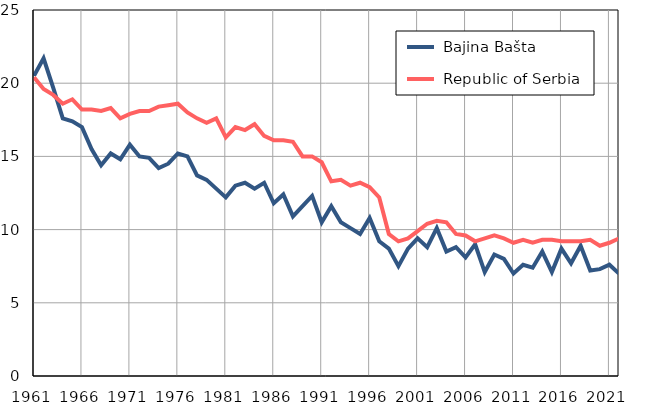
| Category |  Bajina Bašta |  Republic of Serbia |
|---|---|---|
| 1961.0 | 20.5 | 20.4 |
| 1962.0 | 21.7 | 19.6 |
| 1963.0 | 19.7 | 19.2 |
| 1964.0 | 17.6 | 18.6 |
| 1965.0 | 17.4 | 18.9 |
| 1966.0 | 17 | 18.2 |
| 1967.0 | 15.5 | 18.2 |
| 1968.0 | 14.4 | 18.1 |
| 1969.0 | 15.2 | 18.3 |
| 1970.0 | 14.8 | 17.6 |
| 1971.0 | 15.8 | 17.9 |
| 1972.0 | 15 | 18.1 |
| 1973.0 | 14.9 | 18.1 |
| 1974.0 | 14.2 | 18.4 |
| 1975.0 | 14.5 | 18.5 |
| 1976.0 | 15.2 | 18.6 |
| 1977.0 | 15 | 18 |
| 1978.0 | 13.7 | 17.6 |
| 1979.0 | 13.4 | 17.3 |
| 1980.0 | 12.8 | 17.6 |
| 1981.0 | 12.2 | 16.3 |
| 1982.0 | 13 | 17 |
| 1983.0 | 13.2 | 16.8 |
| 1984.0 | 12.8 | 17.2 |
| 1985.0 | 13.2 | 16.4 |
| 1986.0 | 11.8 | 16.1 |
| 1987.0 | 12.4 | 16.1 |
| 1988.0 | 10.9 | 16 |
| 1989.0 | 11.6 | 15 |
| 1990.0 | 12.3 | 15 |
| 1991.0 | 10.5 | 14.6 |
| 1992.0 | 11.6 | 13.3 |
| 1993.0 | 10.5 | 13.4 |
| 1994.0 | 10.1 | 13 |
| 1995.0 | 9.7 | 13.2 |
| 1996.0 | 10.8 | 12.9 |
| 1997.0 | 9.2 | 12.2 |
| 1998.0 | 8.7 | 9.7 |
| 1999.0 | 7.5 | 9.2 |
| 2000.0 | 8.7 | 9.4 |
| 2001.0 | 9.4 | 9.9 |
| 2002.0 | 8.8 | 10.4 |
| 2003.0 | 10.1 | 10.6 |
| 2004.0 | 8.5 | 10.5 |
| 2005.0 | 8.8 | 9.7 |
| 2006.0 | 8.1 | 9.6 |
| 2007.0 | 9 | 9.2 |
| 2008.0 | 7.1 | 9.4 |
| 2009.0 | 8.3 | 9.6 |
| 2010.0 | 8 | 9.4 |
| 2011.0 | 7 | 9.1 |
| 2012.0 | 7.6 | 9.3 |
| 2013.0 | 7.4 | 9.1 |
| 2014.0 | 8.5 | 9.3 |
| 2015.0 | 7.1 | 9.3 |
| 2016.0 | 8.7 | 9.2 |
| 2017.0 | 7.7 | 9.2 |
| 2018.0 | 8.9 | 9.2 |
| 2019.0 | 7.2 | 9.3 |
| 2020.0 | 7.3 | 8.9 |
| 2021.0 | 7.6 | 9.1 |
| 2022.0 | 7 | 9.4 |